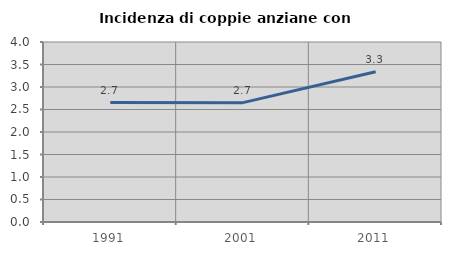
| Category | Incidenza di coppie anziane con figli |
|---|---|
| 1991.0 | 2.655 |
| 2001.0 | 2.653 |
| 2011.0 | 3.341 |